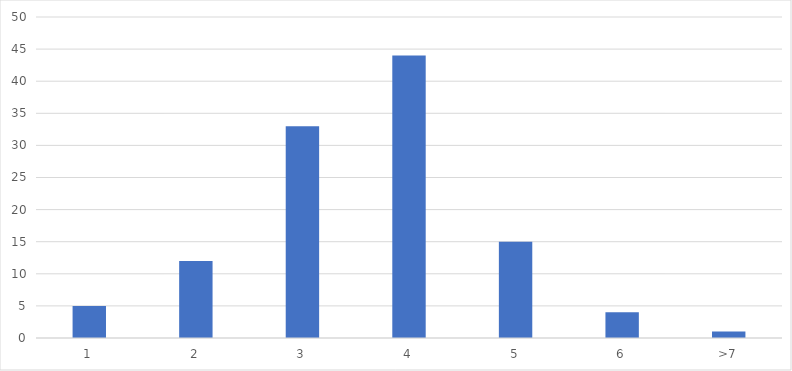
| Category | Number of Responses |
|---|---|
| 1 | 5 |
| 2 | 12 |
| 3 | 33 |
| 4 | 44 |
| 5 | 15 |
| 6 | 4 |
| >7 | 1 |